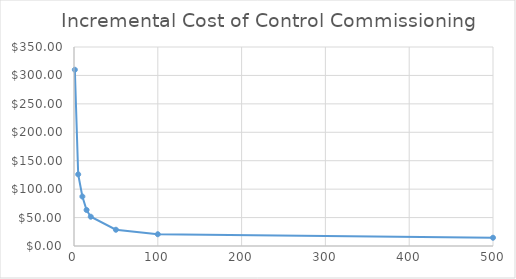
| Category | Series 0 |
|---|---|
| 1.0 | 310 |
| 5.0 | 126 |
| 10.0 | 87 |
| 15.0 | 63.333 |
| 20.0 | 51.5 |
| 50.0 | 28.6 |
| 100.0 | 20.7 |
| 500.0 | 14.54 |